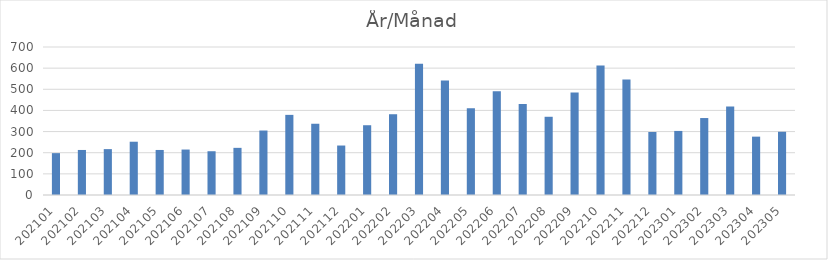
| Category | Summa |
|---|---|
| 202101 | 198 |
| 202102 | 213 |
| 202103 | 217 |
| 202104 | 252 |
| 202105 | 213 |
| 202106 | 215 |
| 202107 | 207 |
| 202108 | 223 |
| 202109 | 305 |
| 202110 | 379 |
| 202111 | 337 |
| 202112 | 234 |
| 202201 | 330 |
| 202202 | 382 |
| 202203 | 621 |
| 202204 | 542 |
| 202205 | 410 |
| 202206 | 491 |
| 202207 | 430 |
| 202208 | 370 |
| 202209 | 485 |
| 202210 | 612 |
| 202211 | 546 |
| 202212 | 298 |
| 202301 | 303 |
| 202302 | 364 |
| 202303 | 418 |
| 202304 | 276 |
| 202305 | 299 |